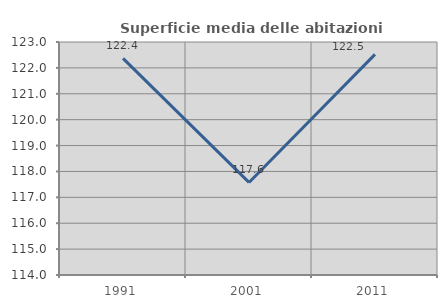
| Category | Superficie media delle abitazioni occupate |
|---|---|
| 1991.0 | 122.368 |
| 2001.0 | 117.576 |
| 2011.0 | 122.522 |